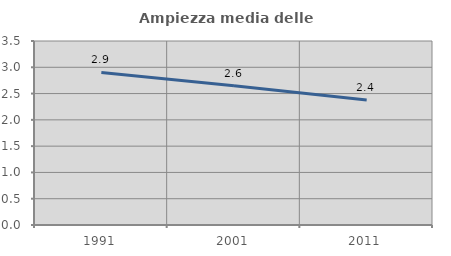
| Category | Ampiezza media delle famiglie |
|---|---|
| 1991.0 | 2.901 |
| 2001.0 | 2.65 |
| 2011.0 | 2.378 |